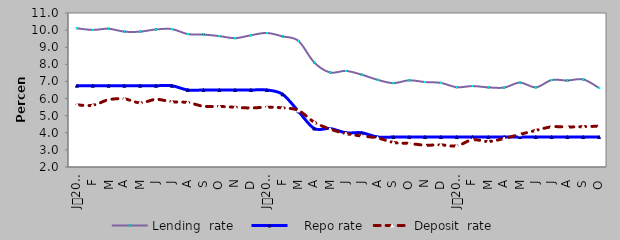
| Category | Lending  |    Repo rate | Deposit  |
|---|---|---|---|
| 0 | 10.11 | 6.75 | 5.63 |
| 1900-01-01 | 10.01 | 6.75 | 5.61 |
| 1900-01-02 | 10.08 | 6.75 | 5.93 |
| 1900-01-03 | 9.91 | 6.75 | 5.98 |
| 1900-01-04 | 9.91 | 6.75 | 5.75 |
| 1900-01-05 | 10.04 | 6.75 | 5.95 |
| 1900-01-06 | 10.06 | 6.75 | 5.813 |
| 1900-01-07 | 9.77 | 6.5 | 5.77 |
| 1900-01-08 | 9.74 | 6.5 | 5.55 |
| 1900-01-09 | 9.65 | 6.5 | 5.54 |
| 1900-01-10 | 9.53 | 6.5 | 5.49 |
| 1900-01-11 | 9.7 | 6.5 | 5.45 |
| 1900-01-12 | 9.833 | 6.5 | 5.497 |
| 1900-01-13 | 9.634 | 6.25 | 5.454 |
| 1900-01-14 | 9.369 | 5.25 | 5.304 |
| 1900-01-15 | 8.106 | 4.25 | 4.617 |
| 1900-01-16 | 7.526 | 4.25 | 4.216 |
| 1900-01-17 | 7.616 | 4 | 3.953 |
| 1900-01-18 | 7.394 | 4 | 3.809 |
| 1900-01-19 | 7.095 | 3.75 | 3.699 |
| 1900-01-20 | 6.902 | 3.75 | 3.437 |
| 1900-01-21 | 7.067 | 3.75 | 3.374 |
| 1900-01-22 | 6.965 | 3.75 | 3.276 |
| 1900-01-23 | 6.917 | 3.75 | 3.292 |
| 1900-01-24 | 6.663 | 3.75 | 3.236 |
| 1900-01-25 | 6.731 | 3.75 | 3.592 |
| 1900-01-26 | 6.653 | 3.75 | 3.488 |
| 1900-01-27 | 6.64 | 3.75 | 3.667 |
| 1900-01-28 | 6.933 | 3.75 | 3.907 |
| 1900-01-29 | 6.654 | 3.75 | 4.137 |
| 1900-01-30 | 7.081 | 3.75 | 4.347 |
| 1900-01-31 | 7.055 | 3.75 | 4.341 |
| 1900-02-01 | 7.118 | 3.75 | 4.357 |
| 1900-02-02 | 6.62 | 3.75 | 4.386 |